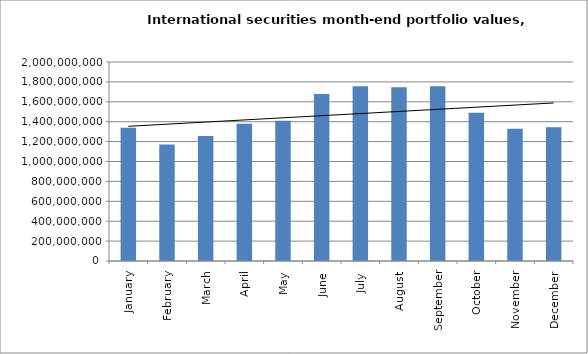
| Category | Series 0 |
|---|---|
| January | 1338227192 |
| February | 1171218616 |
| March | 1255735211 |
| April | 1378759625 |
| May | 1409500182 |
| June | 1678725901 |
| July | 1755387957 |
| August | 1745358988 |
| September | 1756764239 |
| October | 1490999329 |
| November | 1328246393 |
| December | 1344679574 |